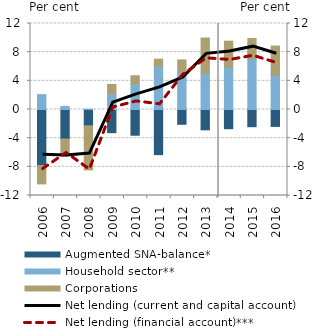
| Category | Augmented SNA-balance* | Household sector** | Corporations |
|---|---|---|---|
| 2006.0 | -7.826 | 2.072 | -2.551 |
| 2007.0 | -4.125 | 0.433 | -2.38 |
| 2008.0 | -2.271 | 0.047 | -6.155 |
| 2009.0 | -3.23 | 2.203 | 1.297 |
| 2010.0 | -3.588 | 3.582 | 1.136 |
| 2011.0 | -6.299 | 6.084 | 0.936 |
| 2012.0 | -2.063 | 5.24 | 1.677 |
| 2013.0 | -2.829 | 5.069 | 4.903 |
| 2014.0 | -2.682 | 5.92 | 3.611 |
| 2015.0 | -2.4 | 7.074 | 2.826 |
| 2016.0 | -2.363 | 4.794 | 4.059 |